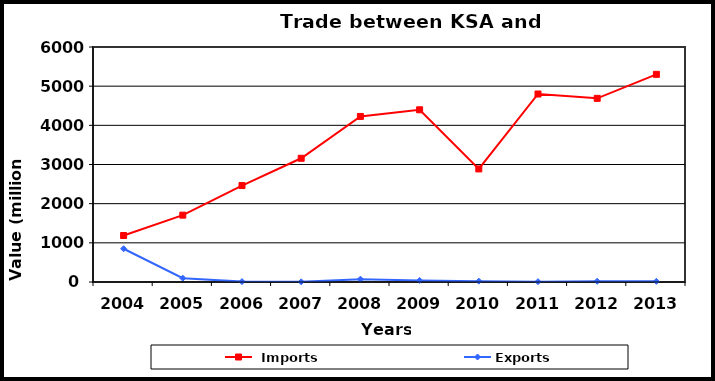
| Category |  Imports | Exports |
|---|---|---|
| 2004.0 | 1187 | 849 |
| 2005.0 | 1707 | 98 |
| 2006.0 | 2463 | 11 |
| 2007.0 | 3159 | 4 |
| 2008.0 | 4227 | 73 |
| 2009.0 | 4397 | 40 |
| 2010.0 | 2887 | 22 |
| 2011.0 | 4800 | 8 |
| 2012.0 | 4689 | 18 |
| 2013.0 | 5302 | 17 |